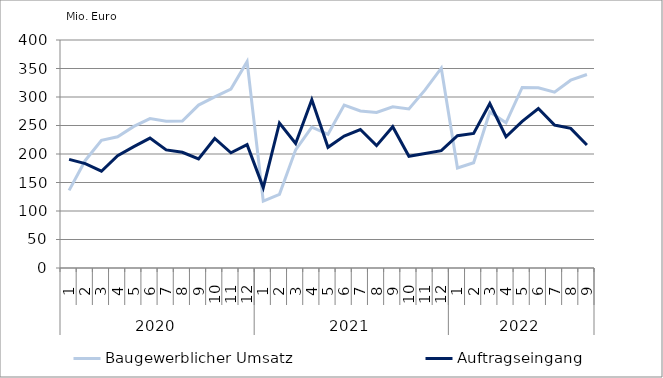
| Category | Baugewerblicher Umsatz | Auftragseingang |
|---|---|---|
| 0 | 136135.432 | 190647.086 |
| 1 | 188682.361 | 183141.14 |
| 2 | 224009.315 | 169770.009 |
| 3 | 230172.252 | 196979.845 |
| 4 | 248410.714 | 212955.83 |
| 5 | 262078.128 | 227853.487 |
| 6 | 257360.37 | 207209.188 |
| 7 | 257932.168 | 202976.091 |
| 8 | 285866.269 | 191463.844 |
| 9 | 300164.57 | 227245.467 |
| 10 | 313922.518 | 202060.636 |
| 11 | 362040.738 | 216296.504 |
| 12 | 117421.805 | 141020.655 |
| 13 | 129162.55 | 254416.876 |
| 14 | 207280.837 | 218451.405 |
| 15 | 247094.279 | 295077.868 |
| 16 | 234515.312 | 211696.129 |
| 17 | 285732.845 | 231455.155 |
| 18 | 275480.885 | 242932.505 |
| 19 | 272787.524 | 214636.944 |
| 20 | 282850.254 | 247827.991 |
| 21 | 279173.21 | 196069.238 |
| 22 | 312511.437 | 201015.897 |
| 23 | 350582.01 | 205949.991 |
| 24 | 175456.852 | 232178.255 |
| 25 | 184578.32 | 236006.862 |
| 26 | 273732.567 | 288451.109 |
| 27 | 254683.671 | 230228.968 |
| 28 | 316794.568 | 257235.39 |
| 29 | 316277.567 | 279900.179 |
| 30 | 308621.034 | 250827.343 |
| 31 | 329490.411 | 244949.341 |
| 32 | 339435.208 | 215809.075 |